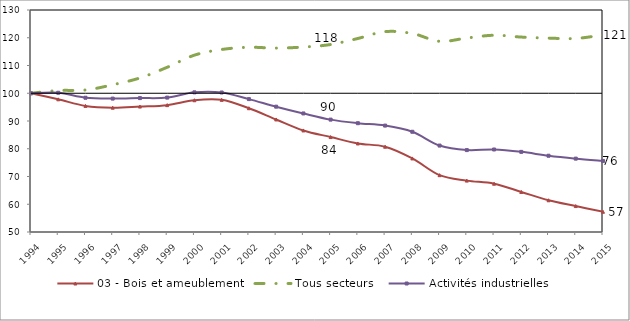
| Category | 03 - Bois et ameublement | Tous secteurs | Activités industrielles | ligne 100 |
|---|---|---|---|---|
| 1994.0 | 100 | 100 | 100 | 100 |
| 1995.0 | 97.812 | 100.976 | 100.177 | 100 |
| 1996.0 | 95.441 | 101.173 | 98.38 | 100 |
| 1997.0 | 94.802 | 103.051 | 98.07 | 100 |
| 1998.0 | 95.206 | 105.521 | 98.25 | 100 |
| 1999.0 | 95.718 | 109.358 | 98.431 | 100 |
| 2000.0 | 97.483 | 113.726 | 100.323 | 100 |
| 2001.0 | 97.616 | 115.771 | 100.271 | 100 |
| 2002.0 | 94.602 | 116.569 | 97.885 | 100 |
| 2003.0 | 90.554 | 116.267 | 95.164 | 100 |
| 2004.0 | 86.594 | 116.656 | 92.721 | 100 |
| 2005.0 | 84.211 | 117.561 | 90.499 | 100 |
| 2006.0 | 81.907 | 119.737 | 89.204 | 100 |
| 2007.0 | 80.729 | 122.208 | 88.346 | 100 |
| 2008.0 | 76.51 | 121.534 | 86.116 | 100 |
| 2009.0 | 70.478 | 118.728 | 81.147 | 100 |
| 2010.0 | 68.517 | 119.898 | 79.514 | 100 |
| 2011.0 | 67.4 | 120.906 | 79.731 | 100 |
| 2012.0 | 64.437 | 120.241 | 78.879 | 100 |
| 2013.0 | 61.441 | 119.868 | 77.479 | 100 |
| 2014.0 | 59.346 | 119.744 | 76.439 | 100 |
| 2015.0 | 57.285 | 121.011 | 75.604 | 100 |